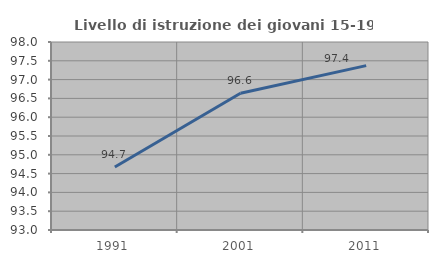
| Category | Livello di istruzione dei giovani 15-19 anni |
|---|---|
| 1991.0 | 94.677 |
| 2001.0 | 96.636 |
| 2011.0 | 97.371 |